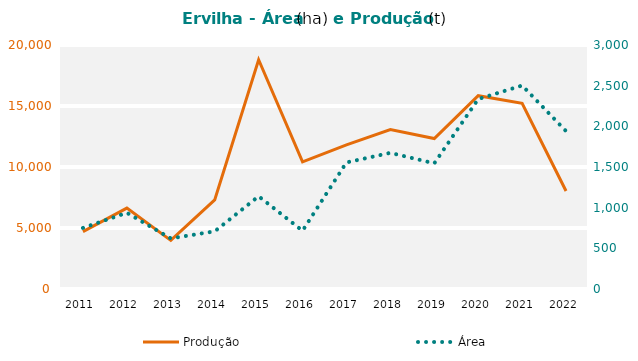
| Category | Produção |
|---|---|
| 2011.0 | 4702 |
| 2012.0 | 6633 |
| 2013.0 | 3981 |
| 2014.0 | 7303 |
| 2015.0 | 18796 |
| 2016.0 | 10420 |
| 2017.0 | 11810 |
| 2018.0 | 13065 |
| 2019.0 | 12335 |
| 2020.0 | 15846 |
| 2021.0 | 15224 |
| 2022.0 | 8033 |